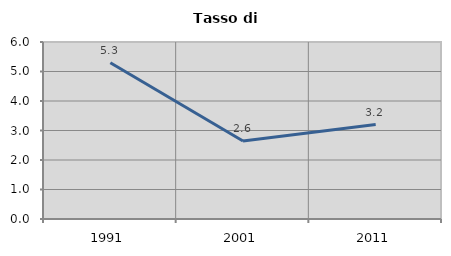
| Category | Tasso di disoccupazione   |
|---|---|
| 1991.0 | 5.295 |
| 2001.0 | 2.642 |
| 2011.0 | 3.202 |